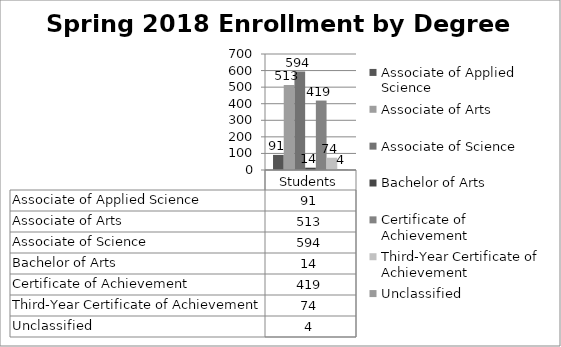
| Category | Associate of Applied Science | Associate of Arts | Associate of Science | Bachelor of Arts | Certificate of Achievement | Third-Year Certificate of Achievement | Unclassified |
|---|---|---|---|---|---|---|---|
| 0 | 91 | 513 | 594 | 14 | 419 | 74 | 4 |